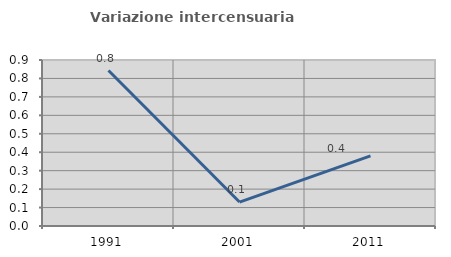
| Category | Variazione intercensuaria annua |
|---|---|
| 1991.0 | 0.843 |
| 2001.0 | 0.13 |
| 2011.0 | 0.38 |